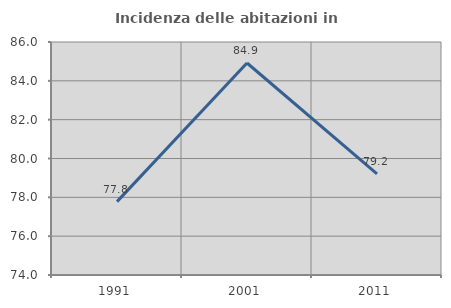
| Category | Incidenza delle abitazioni in proprietà  |
|---|---|
| 1991.0 | 77.778 |
| 2001.0 | 84.918 |
| 2011.0 | 79.205 |